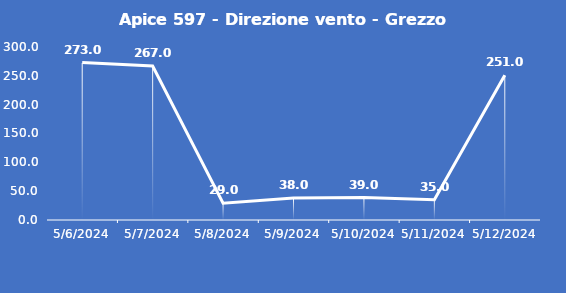
| Category | Apice 597 - Direzione vento - Grezzo (°N) |
|---|---|
| 5/6/24 | 273 |
| 5/7/24 | 267 |
| 5/8/24 | 29 |
| 5/9/24 | 38 |
| 5/10/24 | 39 |
| 5/11/24 | 35 |
| 5/12/24 | 251 |